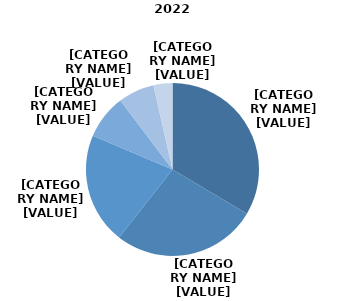
| Category | 2022 |
|---|---|
| 60-64 ani | 0.335 |
| 65-69 ani | 0.271 |
| 70-74 ani | 0.207 |
| 75-79 ani | 0.084 |
| 80-84 ani | 0.067 |
| 85 ani şi peste | 0.035 |